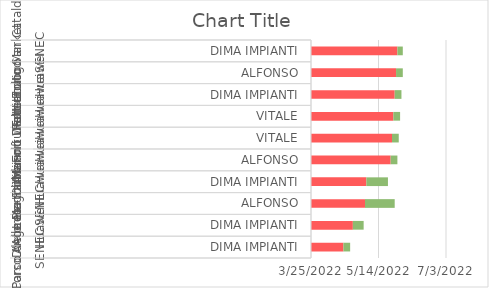
| Category | Series 0 | Series 1 |
|---|---|---|
| 0 | 4/18/22 | 5 |
| 1 | 4/25/22 | 8 |
| 2 | 5/4/22 | 22 |
| 3 | 5/5/22 | 16 |
| 4 | 5/23/22 | 5 |
| 5 | 5/24/22 | 5 |
| 6 | 5/25/22 | 5 |
| 7 | 5/26/22 | 5 |
| 8 | 5/27/22 | 5 |
| 9 | 5/28/22 | 4 |